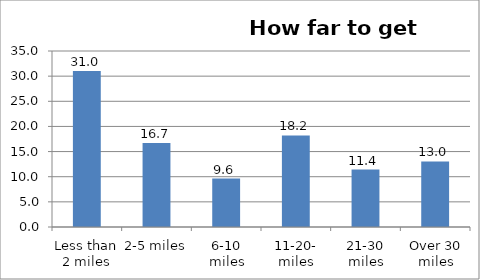
| Category | Series 0 |
|---|---|
| Less than 2 miles | 31.041 |
| 2-5 miles | 16.683 |
| 6-10 miles | 9.623 |
| 11-20- miles | 18.205 |
| 21-30 miles | 11.414 |
| Over 30 miles | 13.035 |